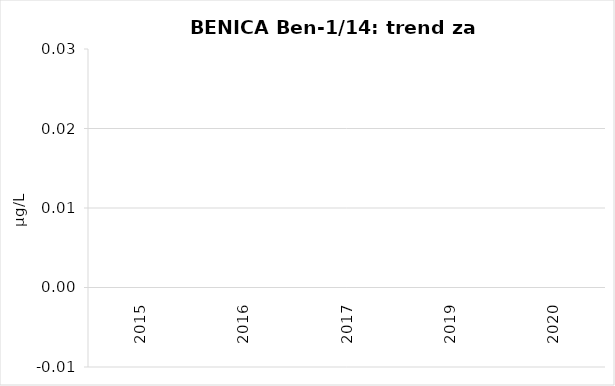
| Category | Vsota |
|---|---|
| 2015 | 0 |
| 2016 | 0 |
| 2017 | 0 |
| 2019 | 0 |
| 2020 | 0 |